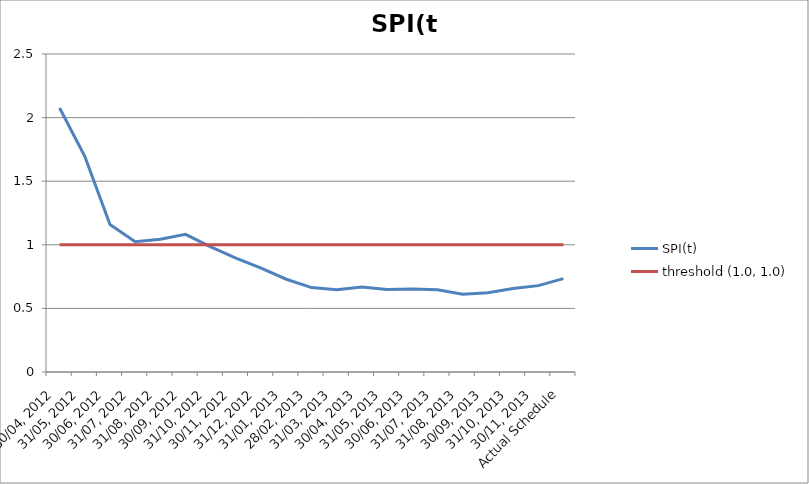
| Category | SPI(t) | threshold (1.0, 1.0) |
|---|---|---|
| 30/04, 2012 | 2.075 | 1 |
| 31/05, 2012 | 1.696 | 1 |
| 30/06, 2012 | 1.16 | 1 |
| 31/07, 2012 | 1.024 | 1 |
| 31/08, 2012 | 1.043 | 1 |
| 30/09, 2012 | 1.082 | 1 |
| 31/10, 2012 | 0.984 | 1 |
| 30/11, 2012 | 0.895 | 1 |
| 31/12, 2012 | 0.816 | 1 |
| 31/01, 2013 | 0.729 | 1 |
| 28/02, 2013 | 0.664 | 1 |
| 31/03, 2013 | 0.648 | 1 |
| 30/04, 2013 | 0.668 | 1 |
| 31/05, 2013 | 0.648 | 1 |
| 30/06, 2013 | 0.652 | 1 |
| 31/07, 2013 | 0.646 | 1 |
| 31/08, 2013 | 0.612 | 1 |
| 30/09, 2013 | 0.623 | 1 |
| 31/10, 2013 | 0.656 | 1 |
| 30/11, 2013 | 0.679 | 1 |
| Actual Schedule | 0.734 | 1 |